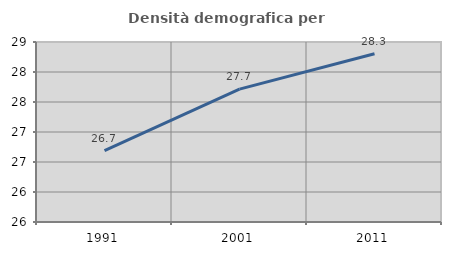
| Category | Densità demografica |
|---|---|
| 1991.0 | 26.69 |
| 2001.0 | 27.715 |
| 2011.0 | 28.304 |